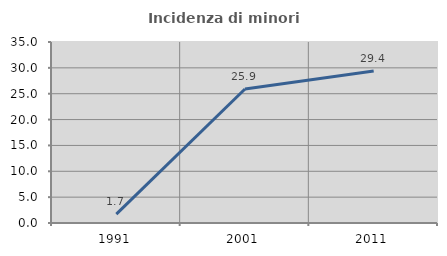
| Category | Incidenza di minori stranieri |
|---|---|
| 1991.0 | 1.724 |
| 2001.0 | 25.904 |
| 2011.0 | 29.412 |